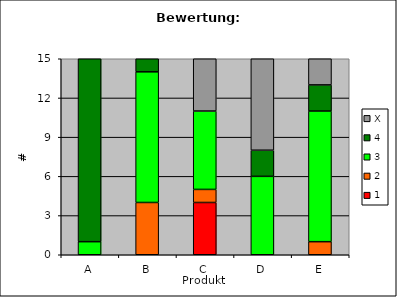
| Category | 1 | 2 | 3 | 4 | X |
|---|---|---|---|---|---|
| A | 0 | 0 | 1 | 14 | 0 |
| B | 0 | 4 | 10 | 1 | 0 |
| C | 4 | 1 | 6 | 0 | 4 |
| D | 0 | 0 | 6 | 2 | 7 |
| E | 0 | 1 | 10 | 2 | 2 |